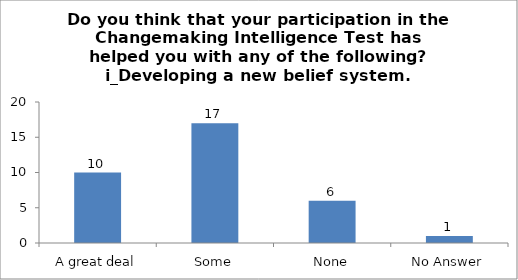
| Category | Do you think that your participation in the Changemaking Intelligence Test has helped you with any of the following?
i_Developing a new belief system. |
|---|---|
| A great deal | 10 |
| Some | 17 |
| None | 6 |
| No Answer | 1 |